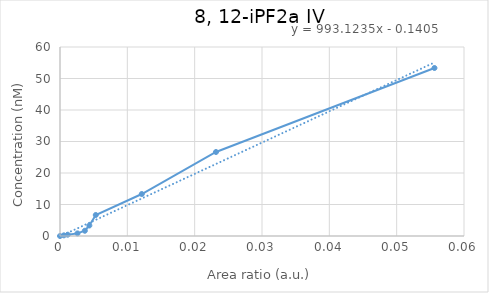
| Category | 8, 12-iPF2a IV |
|---|---|
| 0.0 | 0 |
| 0.000575639599676742 | 0.208 |
| 0.00114610531067021 | 0.417 |
| 0.00259530619579578 | 0.833 |
| 0.00369232346962477 | 1.667 |
| 0.00435904701010653 | 3.333 |
| 0.00531277704335446 | 6.667 |
| 0.0121489984690385 | 13.333 |
| 0.0231668041995277 | 26.667 |
| 0.0556134167681409 | 53.333 |